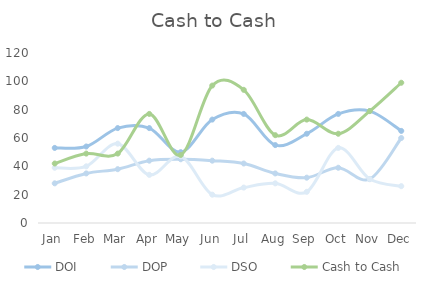
| Category | DOI | DOP | DSO | Cash to Cash |
|---|---|---|---|---|
| Jan | 53 | 28 | 39 | 42 |
| Feb | 54 | 35 | 40 | 49 |
| Mar | 67 | 38 | 56 | 49 |
| Apr | 67 | 44 | 34 | 77 |
| May | 50 | 45 | 47 | 48 |
| Jun | 73 | 44 | 20 | 97 |
| Jul | 77 | 42 | 25 | 94 |
| Aug | 55 | 35 | 28 | 62 |
| Sep | 63 | 32 | 22 | 73 |
| Oct | 77 | 39 | 53 | 63 |
| Nov | 79 | 31 | 31 | 79 |
| Dec | 65 | 60 | 26 | 99 |